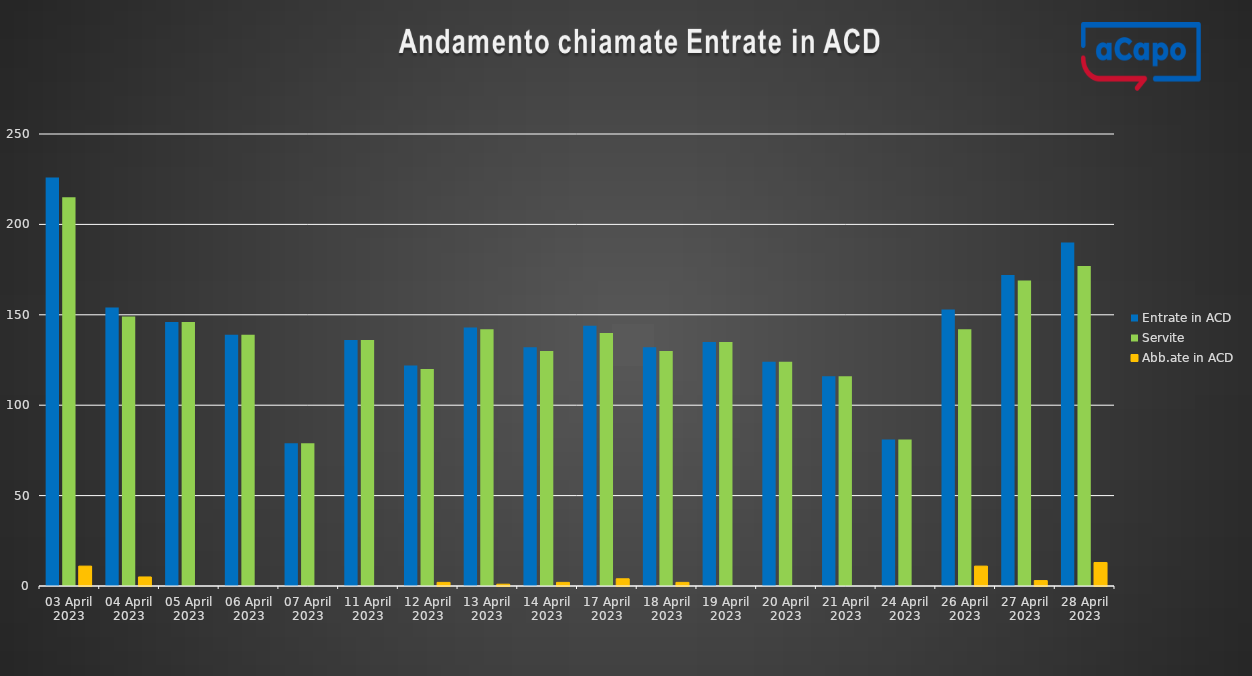
| Category | Entrate in ACD | Servite | Abb.ate in ACD |
|---|---|---|---|
| 2023-04-03 | 226 | 215 | 11 |
| 2023-04-04 | 154 | 149 | 5 |
| 2023-04-05 | 146 | 146 | 0 |
| 2023-04-06 | 139 | 139 | 0 |
| 2023-04-07 | 79 | 79 | 0 |
| 2023-04-11 | 136 | 136 | 0 |
| 2023-04-12 | 122 | 120 | 2 |
| 2023-04-13 | 143 | 142 | 1 |
| 2023-04-14 | 132 | 130 | 2 |
| 2023-04-17 | 144 | 140 | 4 |
| 2023-04-18 | 132 | 130 | 2 |
| 2023-04-19 | 135 | 135 | 0 |
| 2023-04-20 | 124 | 124 | 0 |
| 2023-04-21 | 116 | 116 | 0 |
| 2023-04-24 | 81 | 81 | 0 |
| 2023-04-26 | 153 | 142 | 11 |
| 2023-04-27 | 172 | 169 | 3 |
| 2023-04-28 | 190 | 177 | 13 |